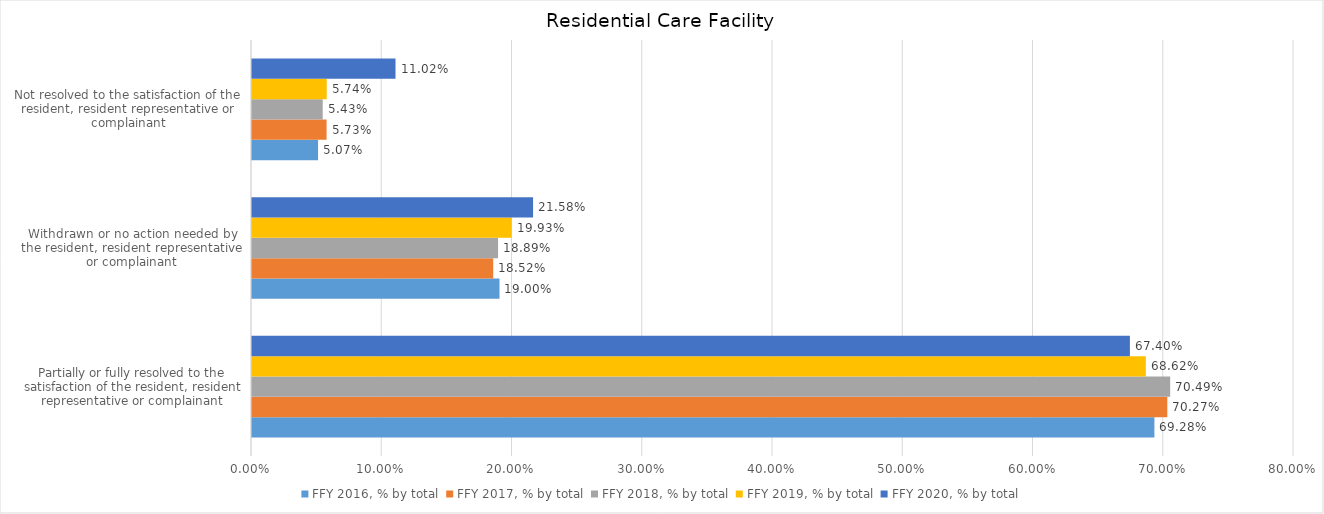
| Category | FFY 2016, % by total | FFY 2017, % by total | FFY 2018, % by total | FFY 2019, % by total | FFY 2020, % by total |
|---|---|---|---|---|---|
| Partially or fully resolved to the satisfaction of the resident, resident representative or complainant | 0.693 | 0.703 | 0.705 | 0.686 | 0.674 |
| Withdrawn or no action needed by the resident, resident representative or complainant | 0.19 | 0.185 | 0.189 | 0.199 | 0.216 |
| Not resolved to the satisfaction of the resident, resident representative or complainant | 0.051 | 0.057 | 0.054 | 0.057 | 0.11 |